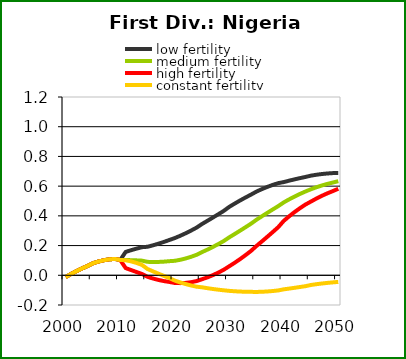
| Category | low fertility | medium fertility | high fertility | constant fertility |
|---|---|---|---|---|
| 2000.0 | -0.012 | -0.012 | -0.012 | -0.012 |
| 2001.0 | 0.009 | 0.009 | 0.009 | 0.009 |
| 2002.0 | 0.029 | 0.029 | 0.029 | 0.029 |
| 2003.0 | 0.046 | 0.046 | 0.046 | 0.046 |
| 2004.0 | 0.062 | 0.062 | 0.062 | 0.062 |
| 2005.0 | 0.081 | 0.081 | 0.081 | 0.081 |
| 2006.0 | 0.093 | 0.093 | 0.093 | 0.093 |
| 2007.0 | 0.101 | 0.101 | 0.101 | 0.101 |
| 2008.0 | 0.107 | 0.107 | 0.107 | 0.107 |
| 2009.0 | 0.11 | 0.11 | 0.11 | 0.11 |
| 2010.0 | 0.103 | 0.103 | 0.103 | 0.103 |
| 2011.0 | 0.157 | 0.103 | 0.048 | 0.101 |
| 2012.0 | 0.169 | 0.102 | 0.035 | 0.094 |
| 2013.0 | 0.18 | 0.1 | 0.022 | 0.083 |
| 2014.0 | 0.189 | 0.099 | 0.009 | 0.069 |
| 2015.0 | 0.192 | 0.09 | -0.01 | 0.043 |
| 2016.0 | 0.202 | 0.089 | -0.022 | 0.027 |
| 2017.0 | 0.212 | 0.09 | -0.031 | 0.011 |
| 2018.0 | 0.224 | 0.092 | -0.039 | -0.004 |
| 2019.0 | 0.237 | 0.095 | -0.045 | -0.018 |
| 2020.0 | 0.25 | 0.097 | -0.052 | -0.035 |
| 2021.0 | 0.266 | 0.104 | -0.053 | -0.048 |
| 2022.0 | 0.283 | 0.113 | -0.051 | -0.059 |
| 2023.0 | 0.301 | 0.124 | -0.046 | -0.069 |
| 2024.0 | 0.321 | 0.138 | -0.039 | -0.077 |
| 2025.0 | 0.345 | 0.156 | -0.027 | -0.081 |
| 2026.0 | 0.367 | 0.173 | -0.014 | -0.087 |
| 2027.0 | 0.389 | 0.191 | 0.001 | -0.092 |
| 2028.0 | 0.411 | 0.21 | 0.018 | -0.097 |
| 2029.0 | 0.434 | 0.231 | 0.038 | -0.101 |
| 2030.0 | 0.461 | 0.256 | 0.061 | -0.105 |
| 2031.0 | 0.483 | 0.278 | 0.084 | -0.108 |
| 2032.0 | 0.504 | 0.301 | 0.109 | -0.11 |
| 2033.0 | 0.524 | 0.324 | 0.136 | -0.111 |
| 2034.0 | 0.543 | 0.347 | 0.164 | -0.112 |
| 2035.0 | 0.563 | 0.374 | 0.198 | -0.112 |
| 2036.0 | 0.58 | 0.398 | 0.228 | -0.111 |
| 2037.0 | 0.595 | 0.421 | 0.26 | -0.109 |
| 2038.0 | 0.609 | 0.443 | 0.292 | -0.106 |
| 2039.0 | 0.62 | 0.466 | 0.324 | -0.102 |
| 2040.0 | 0.627 | 0.491 | 0.366 | -0.095 |
| 2041.0 | 0.637 | 0.511 | 0.397 | -0.089 |
| 2042.0 | 0.646 | 0.53 | 0.426 | -0.084 |
| 2043.0 | 0.654 | 0.548 | 0.452 | -0.079 |
| 2044.0 | 0.662 | 0.564 | 0.477 | -0.073 |
| 2045.0 | 0.671 | 0.579 | 0.497 | -0.065 |
| 2046.0 | 0.677 | 0.593 | 0.517 | -0.06 |
| 2047.0 | 0.682 | 0.605 | 0.535 | -0.055 |
| 2048.0 | 0.685 | 0.615 | 0.552 | -0.051 |
| 2049.0 | 0.688 | 0.624 | 0.567 | -0.048 |
| 2050.0 | 0.689 | 0.633 | 0.582 | -0.044 |